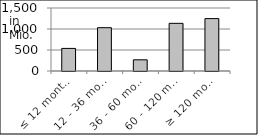
| Category | volume |
|---|---|
| ≤ 12 months | 537820639.5 |
| 12 - 36 months | 1030974532.33 |
| 36 - 60 months | 266002371.69 |
| 60 - 120 months | 1134982694.76 |
| ≥ 120 months | 1247588852.659 |